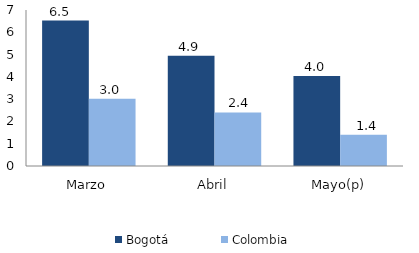
| Category | Bogotá | Colombia |
|---|---|---|
| Marzo | 6.524 | 3.022 |
| Abril | 4.947 | 2.404 |
| Mayo(p) | 4.034 | 1.397 |